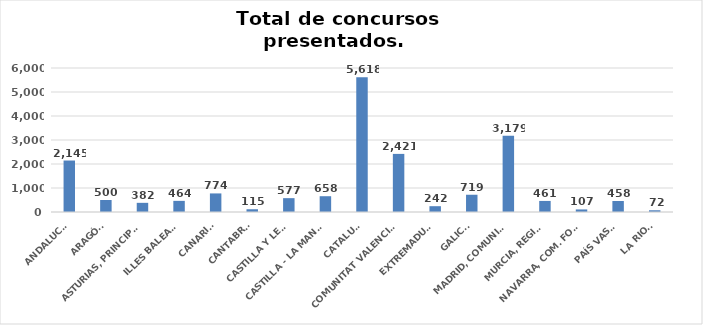
| Category | Series 0 |
|---|---|
| ANDALUCÍA | 2145 |
| ARAGÓN | 500 |
| ASTURIAS, PRINCIPADO | 382 |
| ILLES BALEARS | 464 |
| CANARIAS | 774 |
| CANTABRIA | 115 |
| CASTILLA Y LEÓN | 577 |
| CASTILLA - LA MANCHA | 658 |
| CATALUÑA | 5618 |
| COMUNITAT VALENCIANA | 2421 |
| EXTREMADURA | 242 |
| GALICIA | 719 |
| MADRID, COMUNIDAD | 3179 |
| MURCIA, REGIÓN | 461 |
| NAVARRA, COM. FORAL | 107 |
| PAÍS VASCO | 458 |
| LA RIOJA | 72 |